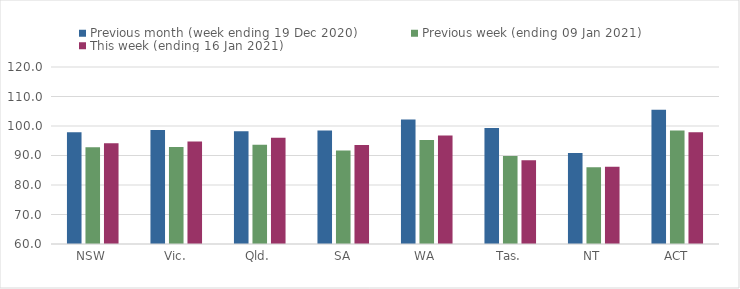
| Category | Previous month (week ending 19 Dec 2020) | Previous week (ending 09 Jan 2021) | This week (ending 16 Jan 2021) |
|---|---|---|---|
| NSW | 97.92 | 92.78 | 94.18 |
| Vic. | 98.67 | 92.92 | 94.72 |
| Qld. | 98.19 | 93.67 | 96.01 |
| SA | 98.47 | 91.71 | 93.58 |
| WA | 102.24 | 95.24 | 96.76 |
| Tas. | 99.35 | 89.83 | 88.38 |
| NT | 90.82 | 85.99 | 86.19 |
| ACT | 105.54 | 98.5 | 97.88 |